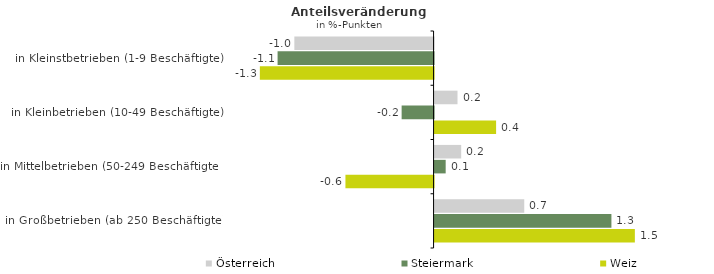
| Category | Österreich | Steiermark | Weiz |
|---|---|---|---|
| in Kleinstbetrieben (1-9 Beschäftigte) | -1.011 | -1.133 | -1.261 |
| in Kleinbetrieben (10-49 Beschäftigte) | 0.167 | -0.232 | 0.447 |
| in Mittelbetrieben (50-249 Beschäftigte) | 0.193 | 0.081 | -0.64 |
| in Großbetrieben (ab 250 Beschäftigte) | 0.651 | 1.284 | 1.454 |